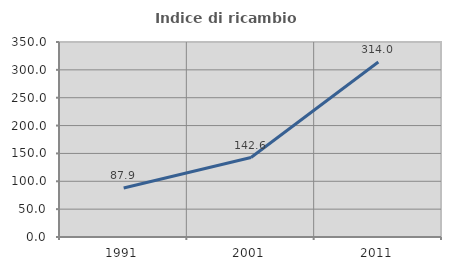
| Category | Indice di ricambio occupazionale  |
|---|---|
| 1991.0 | 87.914 |
| 2001.0 | 142.586 |
| 2011.0 | 313.975 |